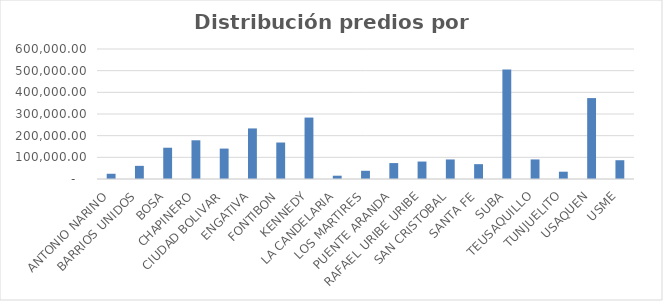
| Category | Series 0 |
|---|---|
| ANTONIO NARINO | 24156 |
| BARRIOS UNIDOS | 60684 |
| BOSA | 144375 |
| CHAPINERO | 178629 |
| CIUDAD BOLIVAR | 140413 |
| ENGATIVA | 233376 |
| FONTIBON | 168340 |
| KENNEDY | 283507 |
| LA CANDELARIA | 15234 |
| LOS MARTIRES | 37938 |
| PUENTE ARANDA | 73525 |
| RAFAEL URIBE URIBE | 80576 |
| SAN CRISTOBAL | 90178 |
| SANTA FE | 68500 |
| SUBA | 505265 |
| TEUSAQUILLO | 90281 |
| TUNJUELITO | 33687 |
| USAQUEN | 373401 |
| USME | 86647 |